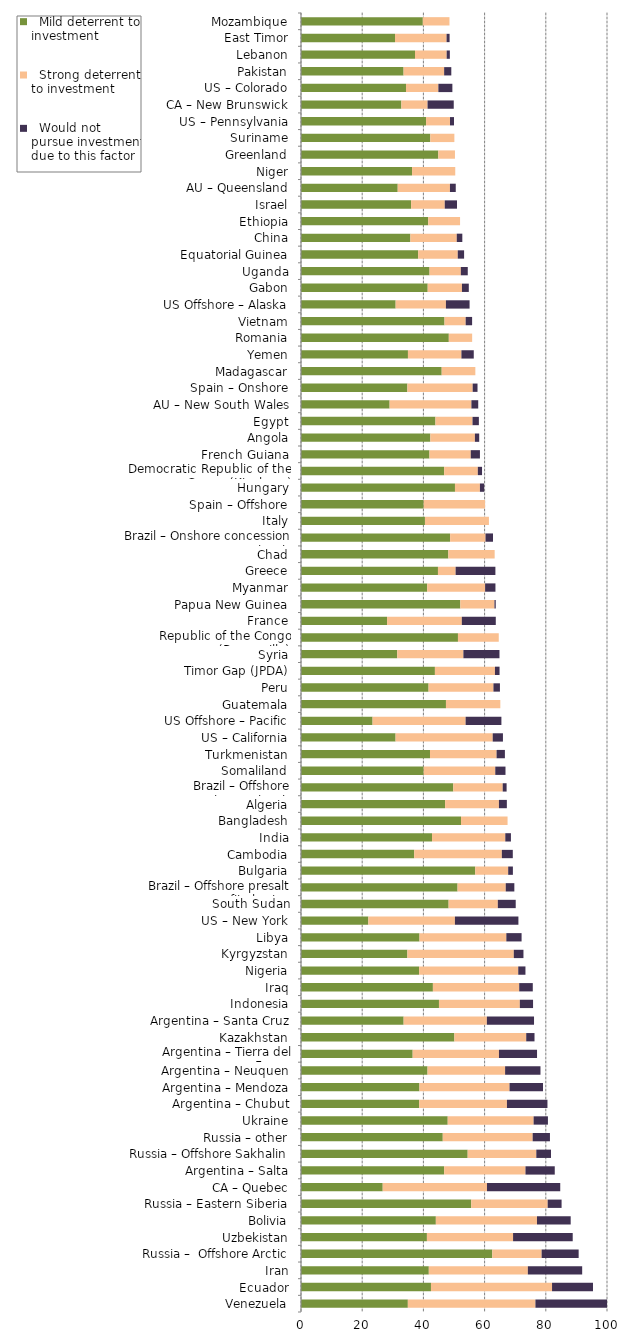
| Category |   Mild deterrent to investment |   Strong deterrent to investment |   Would not pursue investment due to this factor |
|---|---|---|---|
| Venezuela | 34.915 | 41.695 | 23.39 |
| Ecuador | 42.474 | 39.565 | 13.382 |
| Iran | 41.768 | 32.37 | 17.751 |
| Russia –  Offshore Arctic | 62.507 | 16.131 | 12.098 |
| Uzbekistan | 41.149 | 28.154 | 19.492 |
| Bolivia | 44.068 | 33.051 | 11.017 |
| Russia – Eastern Siberia | 55.636 | 24.979 | 4.542 |
| CA – Quebec | 26.705 | 34.072 | 23.942 |
| Argentina – Salta | 46.78 | 26.579 | 9.569 |
| Russia – Offshore Sakhalin | 54.469 | 22.429 | 4.806 |
| Russia – other | 46.328 | 29.379 | 5.65 |
| Ukraine | 47.949 | 28.068 | 4.678 |
| Argentina – Chubut | 38.615 | 28.686 | 13.24 |
| Argentina – Mendoza | 38.703 | 29.448 | 10.938 |
| Argentina – Neuquen | 41.355 | 25.346 | 11.562 |
| Argentina – Tierra del Fuego | 36.495 | 28.201 | 12.441 |
| Kazakhstan | 50.121 | 23.48 | 2.709 |
| Argentina – Santa Cruz | 33.544 | 27.197 | 15.412 |
| Indonesia | 45.087 | 26.43 | 4.319 |
| Iraq | 43.103 | 28.207 | 4.437 |
| Nigeria | 38.59 | 32.404 | 2.357 |
| Kyrgyzstan | 34.769 | 34.769 | 3.161 |
| Libya | 38.727 | 28.375 | 4.985 |
| US – New York | 22.007 | 28.294 | 20.749 |
| South Sudan | 48.242 | 16.081 | 5.847 |
| Brazil – Offshore presalt area profit sharing contracts | 51.165 | 15.743 | 2.811 |
| Bulgaria | 56.936 | 10.772 | 1.539 |
| Cambodia | 36.994 | 28.641 | 3.58 |
| India | 42.82 | 23.942 | 1.842 |
| Bangladesh | 52.294 | 15.213 | 0 |
| Algeria | 47.09 | 17.594 | 2.587 |
| Brazil – Offshore concession contracts | 49.757 | 16.16 | 1.276 |
| Somaliland | 40.097 | 23.39 | 3.341 |
| Turkmenistan | 42.156 | 21.758 | 2.72 |
| US – California | 30.908 | 31.743 | 3.341 |
| US Offshore – Pacific | 23.39 | 30.407 | 11.695 |
| Guatemala | 47.372 | 17.764 | 0 |
| Peru | 41.692 | 21.199 | 2.12 |
| Timor Gap (JPDA) | 43.762 | 19.617 | 1.509 |
| Syria | 31.449 | 21.621 | 11.793 |
| Republic of the Congo (Brazzaville) | 51.293 | 13.336 | 0 |
| France | 28.127 | 24.426 | 11.103 |
| Papua New Guinea | 52.069 | 11.158 | 0.413 |
| Myanmar | 41.236 | 18.928 | 3.38 |
| Greece | 44.758 | 5.775 | 12.994 |
| Chad | 48.156 | 15.135 | 0 |
| Brazil – Onshore concession contracts | 48.729 | 11.573 | 2.436 |
| Italy | 40.508 | 20.907 | 0 |
| Spain – Offshore | 40.097 | 20.048 | 0 |
| Hungary | 50.315 | 8.159 | 1.36 |
| Democratic Republic of the Congo (Kinshasa) | 46.78 | 11.007 | 1.376 |
| French Guiana | 41.982 | 13.494 | 2.999 |
| Angola | 42.271 | 14.56 | 1.409 |
| Egypt | 43.942 | 12.11 | 2.076 |
| AU – New South Wales | 28.959 | 26.731 | 2.228 |
| Spain – Onshore | 34.769 | 21.335 | 1.58 |
| Madagascar | 45.98 | 10.995 | 0 |
| Yemen | 34.95 | 17.475 | 4.033 |
| Romania | 48.305 | 7.627 | 0 |
| Vietnam | 46.9 | 6.915 | 2.104 |
| US Offshore – Alaska | 30.929 | 16.431 | 7.732 |
| Gabon | 41.408 | 11.191 | 2.238 |
| Uganda | 42.011 | 10.219 | 2.271 |
| Equatorial Guinea | 38.293 | 12.937 | 2.07 |
| China | 35.751 | 15.149 | 1.818 |
| Ethiopia | 41.582 | 10.395 | 0 |
| Israel | 35.984 | 10.995 | 3.998 |
| AU – Queensland | 31.608 | 17.068 | 1.896 |
| Niger | 36.295 | 14.115 | 0 |
| Greenland | 44.876 | 5.439 | 0 |
| Suriname | 42.259 | 7.862 | 0 |
| US – Pennsylvania | 40.867 | 7.826 | 1.304 |
| CA – New Brunswick | 32.803 | 8.557 | 8.557 |
| US – Colorado | 34.313 | 10.58 | 4.575 |
| Pakistan | 33.525 | 13.254 | 2.339 |
| Lebanon | 37.258 | 10.349 | 1.035 |
| East Timor | 30.724 | 16.849 | 0.991 |
| Mozambique | 39.812 | 8.709 | 0 |